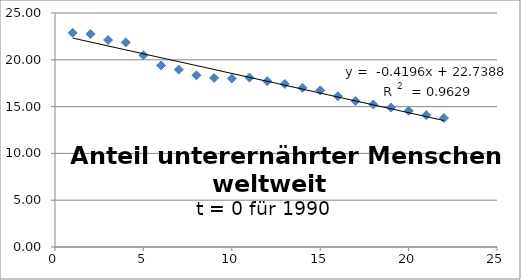
| Category | Series 0 |
|---|---|
| 1.0 | 22.882 |
| 2.0 | 22.766 |
| 3.0 | 22.112 |
| 4.0 | 21.854 |
| 5.0 | 20.482 |
| 6.0 | 19.399 |
| 7.0 | 18.954 |
| 8.0 | 18.342 |
| 9.0 | 18.063 |
| 10.0 | 17.998 |
| 11.0 | 18.098 |
| 12.0 | 17.721 |
| 13.0 | 17.42 |
| 14.0 | 17.007 |
| 15.0 | 16.742 |
| 16.0 | 16.109 |
| 17.0 | 15.582 |
| 18.0 | 15.229 |
| 19.0 | 14.904 |
| 20.0 | 14.555 |
| 21.0 | 14.095 |
| 22.0 | 13.778 |